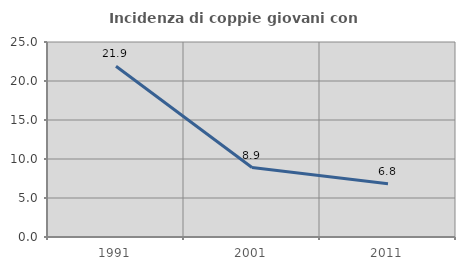
| Category | Incidenza di coppie giovani con figli |
|---|---|
| 1991.0 | 21.895 |
| 2001.0 | 8.902 |
| 2011.0 | 6.829 |